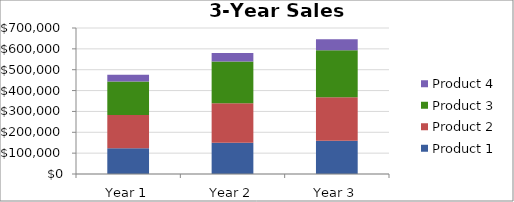
| Category | Product 1 | Product 2 | Product 3 | Product 4 |
|---|---|---|---|---|
| Year 1 | 123554 | 159856 | 160300 | 32400 |
| Year 2 | 150120 | 189612 | 199080 | 41297 |
| Year 3 | 159600 | 208725 | 224774 | 52762 |